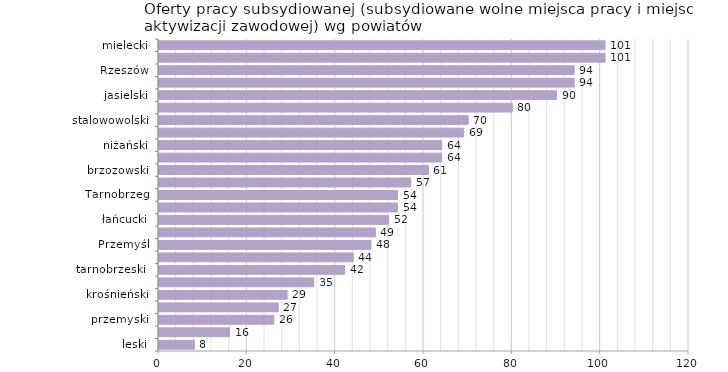
| Category | Oferty pracy subsydiowanej (subsydiowane wolne miejsca pracy i miejsca aktywizacji zawodowej) wg powiatów |
|---|---|
| leski | 8 |
| bieszczadzki | 16 |
| przemyski | 26 |
| Krosno | 27 |
| krośnieński | 29 |
| lubaczowski | 35 |
| tarnobrzeski  | 42 |
| leżajski | 44 |
| Przemyśl | 48 |
| rzeszowski | 49 |
| łańcucki | 52 |
| ropczycko-sędziszowski | 54 |
| Tarnobrzeg | 54 |
| sanocki | 57 |
| brzozowski | 61 |
| kolbuszowski | 64 |
| niżański | 64 |
| dębicki | 69 |
| stalowowolski | 70 |
| strzyżowski | 80 |
| jasielski | 90 |
| przeworski | 94 |
| Rzeszów | 94 |
| jarosławski | 101 |
| mielecki | 101 |